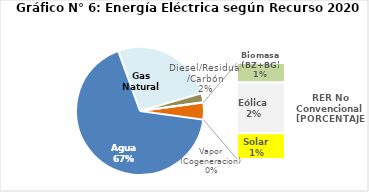
| Category | Series 0 |
|---|---|
| Agua | 3344.829 |
| Gas Natural | 1295.389 |
| Diesel/Residual/Carbón | 114.616 |
| Vapor (Cogeneracion) | 0.348 |
| Biomasa (BZ+BG) | 43.707 |
| Eólica | 112.897 |
| Solar | 57.716 |